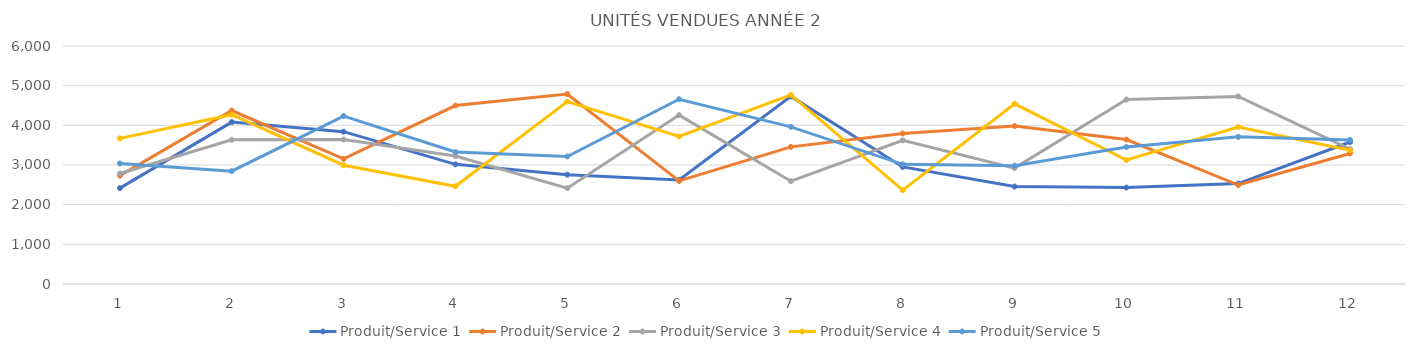
| Category | Produit/Service 1 | Produit/Service 2 | Produit/Service 3 | Produit/Service 4 | Produit/Service 5 |
|---|---|---|---|---|---|
| 0 | 2418 | 2732 | 2786 | 3672 | 3039 |
| 1 | 4081 | 4373 | 3636 | 4269 | 2845 |
| 2 | 3840 | 3155 | 3640 | 2995 | 4234 |
| 3 | 3016 | 4498 | 3226 | 2463 | 3327 |
| 4 | 2757 | 4788 | 2416 | 4599 | 3215 |
| 5 | 2625 | 2598 | 4258 | 3719 | 4658 |
| 6 | 4729 | 3457 | 2592 | 4768 | 3962 |
| 7 | 2952 | 3795 | 3620 | 2366 | 3017 |
| 8 | 2456 | 3981 | 2921 | 4542 | 2982 |
| 9 | 2431 | 3641 | 4649 | 3126 | 3454 |
| 10 | 2531 | 2495 | 4729 | 3958 | 3710 |
| 11 | 3580 | 3291 | 3400 | 3372 | 3632 |